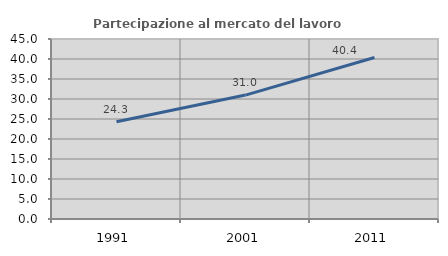
| Category | Partecipazione al mercato del lavoro  femminile |
|---|---|
| 1991.0 | 24.314 |
| 2001.0 | 30.981 |
| 2011.0 | 40.381 |